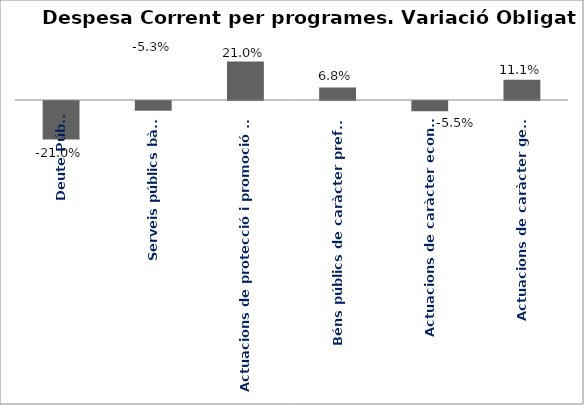
| Category | Series 0 |
|---|---|
| Deute Públic | -0.21 |
| Serveis públics bàsics | -0.053 |
| Actuacions de protecció i promoció social | 0.21 |
| Béns públics de caràcter preferent | 0.068 |
| Actuacions de caràcter econòmic | -0.055 |
| Actuacions de caràcter general | 0.111 |